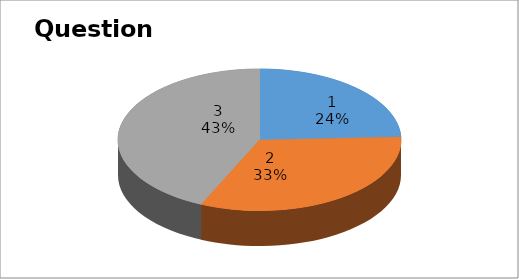
| Category | Series 0 |
|---|---|
| 0 | 9 |
| 1 | 12 |
| 2 | 16 |